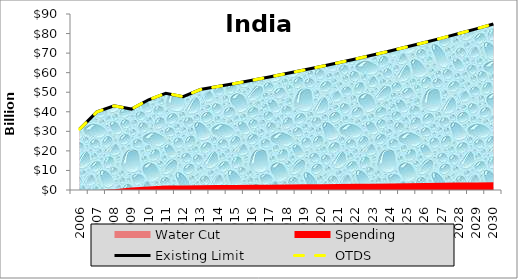
| Category | Existing Limit | OTDS |
|---|---|---|
| 0 | 31111702000 | 31111702000 |
| 1 | 39926360000 | 39926360000 |
| 2 | 43012342000 | 43012342000 |
| 3 | 41379604000 | 41379604000 |
| 4 | 46126178000 | 46126178000 |
| 5 | 49472700000 | 49472700000 |
| 6 | 47734470000 | 47734470000 |
| 7 | 51356354000 | 51356354000 |
| 8 | 52897044620 | 52897044620 |
| 9 | 54483955958.6 | 54483955958.6 |
| 10 | 56118474637.358 | 56118474637.358 |
| 11 | 57802028876.479 | 57802028876.479 |
| 12 | 59536089742.773 | 59536089742.773 |
| 13 | 61322172435.056 | 61322172435.056 |
| 14 | 63161837608.108 | 63161837608.108 |
| 15 | 65056692736.351 | 65056692736.351 |
| 16 | 67008393518.442 | 67008393518.442 |
| 17 | 69018645323.995 | 69018645323.995 |
| 18 | 71089204683.715 | 71089204683.715 |
| 19 | 73221880824.226 | 73221880824.226 |
| 20 | 75418537248.953 | 75418537248.953 |
| 21 | 77681093366.422 | 77681093366.422 |
| 22 | 80011526167.414 | 80011526167.414 |
| 23 | 82411871952.437 | 82411871952.437 |
| 24 | 84884228111.01 | 84884228111.01 |